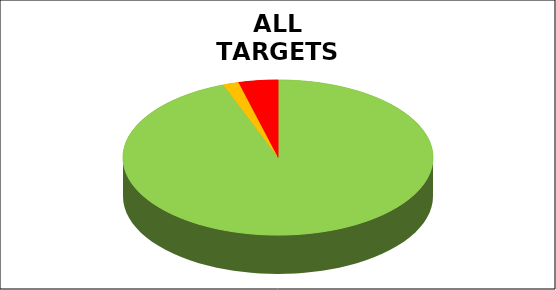
| Category | Series 0 |
|---|---|
| Green | 0.943 |
| Amber | 0.016 |
| Red | 0.041 |